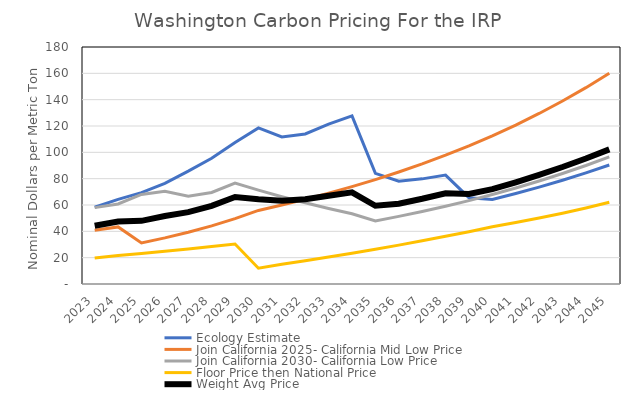
| Category | Ecology Estimate | Join California 2025- California Mid Low Price | Join California 2030- California Low Price | Floor Price then National Price | Weight Avg Price |
|---|---|---|---|---|---|
| 2023.0 | 58.31 | 40.74 | 58 | 19.7 | 44.188 |
| 2024.0 | 64.27 | 43.344 | 60.805 | 21.67 | 47.523 |
| 2025.0 | 69.358 | 31.24 | 67.998 | 23.187 | 47.946 |
| 2026.0 | 76.426 | 35.011 | 70.385 | 24.81 | 51.658 |
| 2027.0 | 85.698 | 39.289 | 66.711 | 26.547 | 54.561 |
| 2028.0 | 95.482 | 44.14 | 69.523 | 28.405 | 59.387 |
| 2029.0 | 107.535 | 49.639 | 76.675 | 30.393 | 66.061 |
| 2030.0 | 118.519 | 55.876 | 71.308 | 12 | 64.426 |
| 2031.0 | 111.651 | 59.939 | 66.316 | 15.031 | 63.234 |
| 2032.0 | 113.957 | 64.286 | 61.674 | 17.692 | 64.402 |
| 2033.0 | 121.394 | 68.942 | 57.357 | 20.469 | 67.04 |
| 2034.0 | 127.649 | 73.94 | 53.342 | 23.362 | 69.573 |
| 2035.0 | 84.012 | 79.304 | 47.874 | 26.379 | 59.392 |
| 2036.0 | 78.008 | 85.053 | 51.345 | 29.519 | 60.981 |
| 2037.0 | 79.854 | 91.216 | 55.065 | 32.789 | 64.731 |
| 2038.0 | 82.739 | 97.827 | 59.056 | 36.194 | 68.954 |
| 2039.0 | 65.557 | 104.928 | 63.343 | 39.737 | 68.391 |
| 2040.0 | 64.129 | 112.555 | 67.948 | 43.427 | 72.015 |
| 2041.0 | 68.69 | 120.74 | 72.889 | 46.632 | 77.238 |
| 2042.0 | 73.558 | 129.529 | 78.194 | 50.084 | 82.841 |
| 2043.0 | 78.777 | 138.971 | 83.895 | 53.798 | 88.86 |
| 2044.0 | 84.378 | 149.11 | 90.015 | 57.788 | 95.323 |
| 2045.0 | 90.363 | 160.005 | 96.592 | 62.076 | 102.259 |